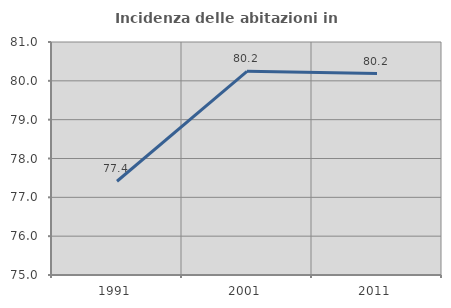
| Category | Incidenza delle abitazioni in proprietà  |
|---|---|
| 1991.0 | 77.414 |
| 2001.0 | 80.245 |
| 2011.0 | 80.186 |